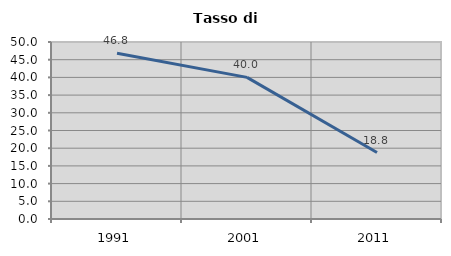
| Category | Tasso di disoccupazione   |
|---|---|
| 1991.0 | 46.805 |
| 2001.0 | 40 |
| 2011.0 | 18.782 |